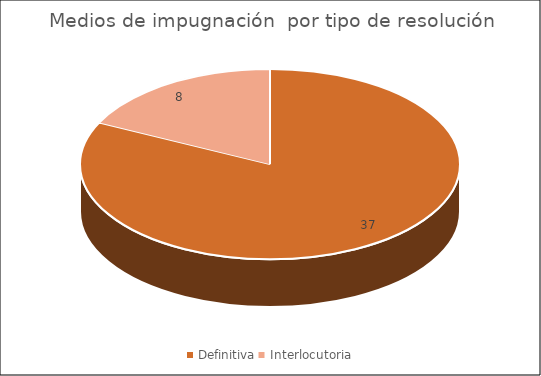
| Category | Medios de impugnación  por tipo de resolución |
|---|---|
| Definitiva | 37 |
| Interlocutoria | 8 |